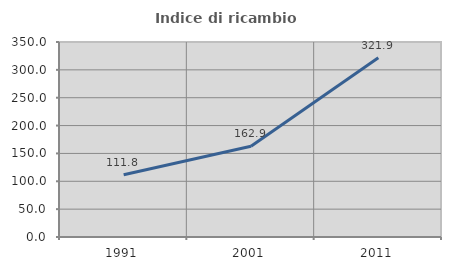
| Category | Indice di ricambio occupazionale  |
|---|---|
| 1991.0 | 111.77 |
| 2001.0 | 162.889 |
| 2011.0 | 321.918 |